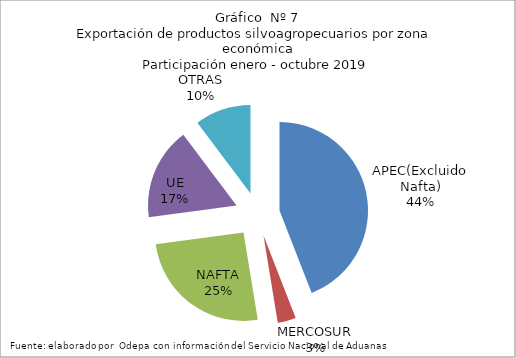
| Category | Series 0 |
|---|---|
| APEC(Excluido Nafta) | 6313512.842 |
| MERCOSUR | 479209.966 |
| NAFTA | 3646925.406 |
| UE | 2416805.755 |
| OTRAS | 1468325.03 |